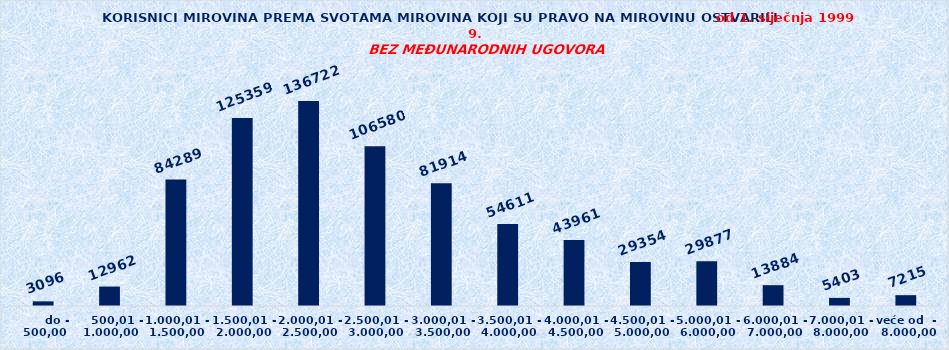
| Category | Series 0 |
|---|---|
|       do - 500,00 | 3096 |
|    500,01 - 1.000,00 | 12962 |
| 1.000,01 - 1.500,00 | 84289 |
| 1.500,01 - 2.000,00 | 125359 |
| 2.000,01 - 2.500,00 | 136722 |
| 2.500,01 - 3.000,00 | 106580 |
| 3.000,01 - 3.500,00 | 81914 |
| 3.500,01 - 4.000,00 | 54611 |
| 4.000,01 - 4.500,00 | 43961 |
| 4.500,01 - 5.000,00 | 29354 |
| 5.000,01 - 6.000,00 | 29877 |
| 6.000,01 - 7.000,00 | 13884 |
| 7.000,01 - 8.000,00 | 5403 |
| veće od  -  8.000,00 | 7215 |